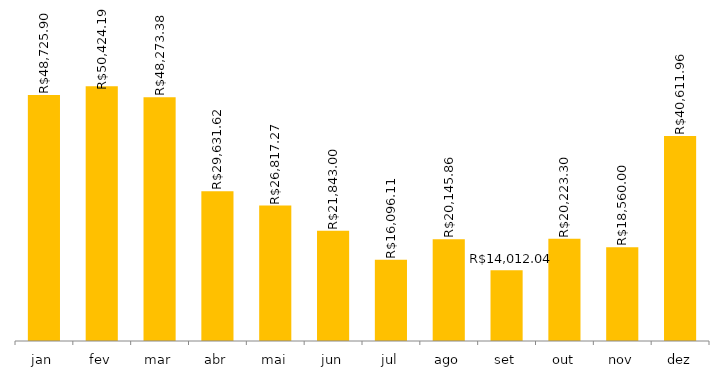
| Category | 2021 |
|---|---|
| jan | 48725.9 |
| fev | 50424.19 |
| mar | 48273.38 |
| abr | 29631.62 |
| mai | 26817.27 |
| jun | 21843 |
| jul | 16096.11 |
| ago | 20145.86 |
| set | 14012.04 |
| out | 20223.3 |
| nov | 18560 |
| dez | 40611.96 |